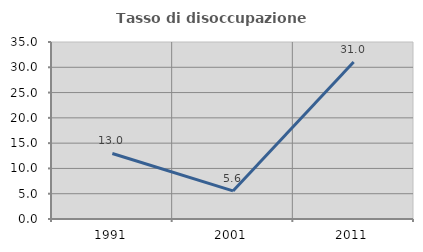
| Category | Tasso di disoccupazione giovanile  |
|---|---|
| 1991.0 | 12.963 |
| 2001.0 | 5.556 |
| 2011.0 | 31.034 |